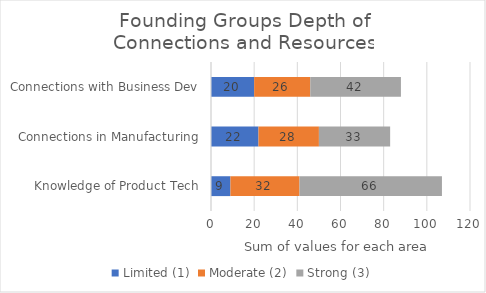
| Category | Limited (1) | Moderate (2) | Strong (3) |
|---|---|---|---|
| Knowledge of Product Tech | 9 | 32 | 66 |
| Connections in Manufacturing | 22 | 28 | 33 |
| Connections with Business Dev | 20 | 26 | 42 |